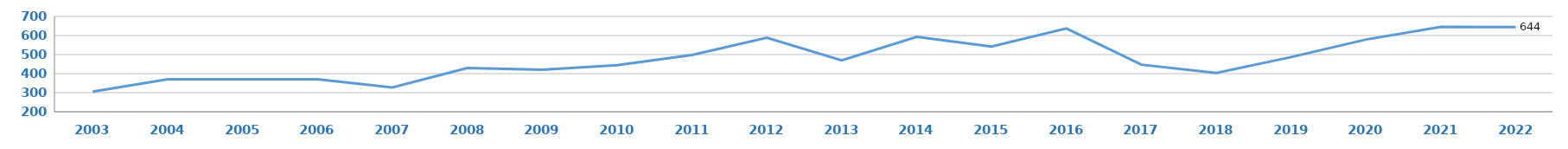
| Category | CFG |
|---|---|
| 2003.0 | 306 |
| 2004.0 | 370 |
| 2005.0 | 370 |
| 2006.0 | 370 |
| 2007.0 | 327 |
| 2008.0 | 429 |
| 2009.0 | 421 |
| 2010.0 | 444 |
| 2011.0 | 498 |
| 2012.0 | 588 |
| 2013.0 | 470 |
| 2014.0 | 593 |
| 2015.0 | 542 |
| 2016.0 | 637 |
| 2017.0 | 447 |
| 2018.0 | 403 |
| 2019.0 | 487 |
| 2020.0 | 579 |
| 2021.0 | 645 |
| 2022.0 | 644 |